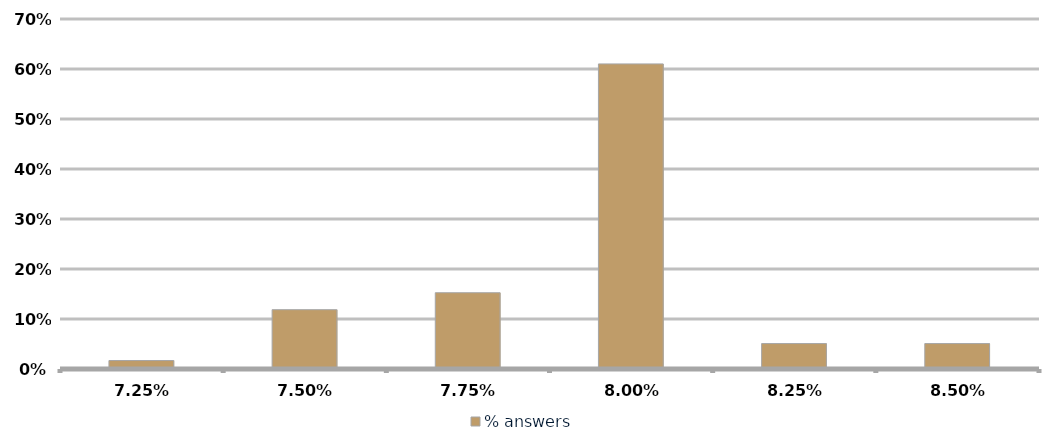
| Category | % answers |
|---|---|
| 0.0725 | 0.017 |
| 0.075 | 0.119 |
| 0.0775 | 0.153 |
| 0.08 | 0.61 |
| 0.0825 | 0.051 |
| 0.085 | 0.051 |